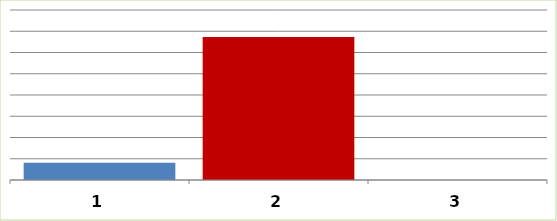
| Category | Series 0 |
|---|---|
| 0 | 408649 |
| 1 | 3364000 |
| 2 | 0 |